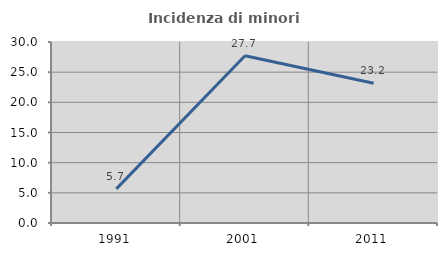
| Category | Incidenza di minori stranieri |
|---|---|
| 1991.0 | 5.66 |
| 2001.0 | 27.719 |
| 2011.0 | 23.169 |